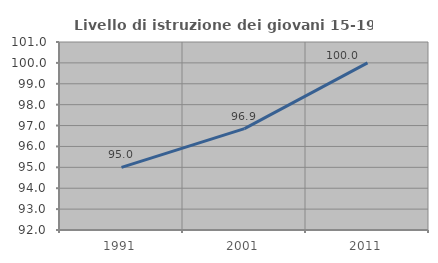
| Category | Livello di istruzione dei giovani 15-19 anni |
|---|---|
| 1991.0 | 95 |
| 2001.0 | 96.85 |
| 2011.0 | 100 |